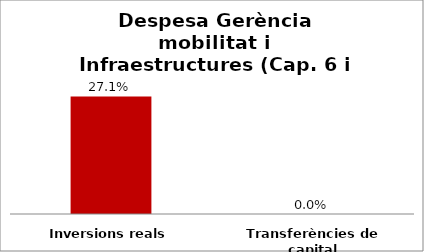
| Category | Series 0 |
|---|---|
| Inversions reals | 0.271 |
| Transferències de capital | 0 |